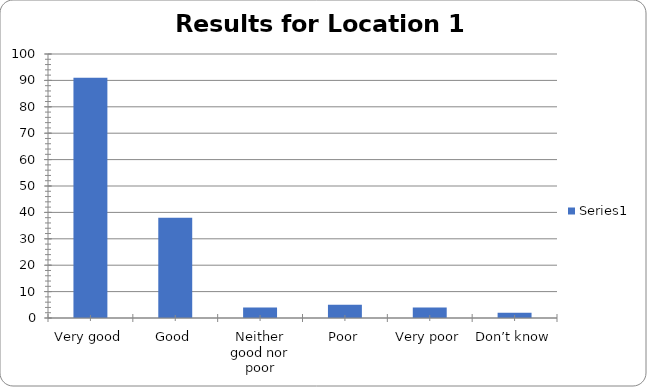
| Category | Series 0 |
|---|---|
| Very good | 91 |
| Good | 38 |
| Neither good nor poor | 4 |
| Poor | 5 |
| Very poor | 4 |
| Don’t know | 2 |